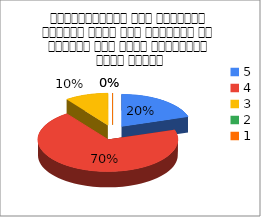
| Category | महाविद्यालय में छात्रों द्वारा आपके साथ व्यवहार के संदर्भ में अपनी संतुष्टि स्तर बताइए |
|---|---|
| 5.0 | 2 |
| 4.0 | 7 |
| 3.0 | 1 |
| 2.0 | 0 |
| 1.0 | 0 |